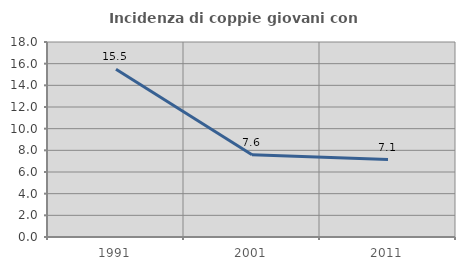
| Category | Incidenza di coppie giovani con figli |
|---|---|
| 1991.0 | 15.476 |
| 2001.0 | 7.595 |
| 2011.0 | 7.143 |